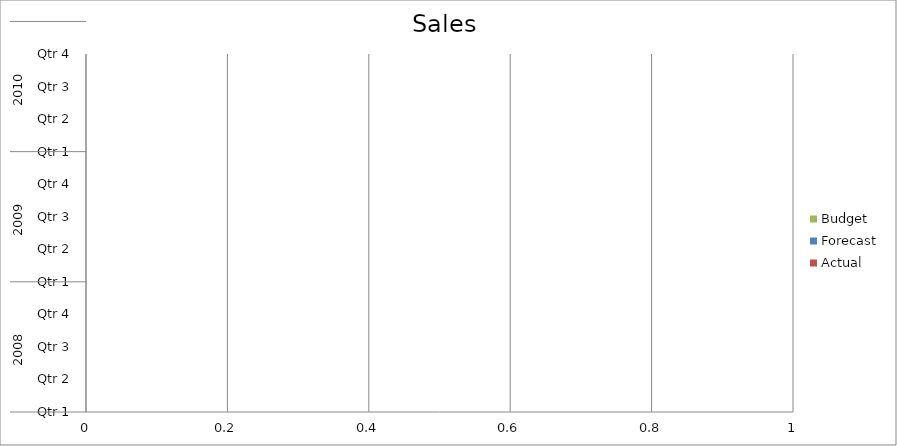
| Category | Budget | Forecast | Actual |
|---|---|---|---|
| 0 | 3420 | 3490 | 1020 |
| 1 | 1600 | 1290 | 3110 |
| 2 | 2160 | 2420 | 1310 |
| 3 | 1030 | 3050 | 2800 |
| 4 | 1270 | 3460 | 500 |
| 5 | 1450 | 2380 | 1500 |
| 6 | 2450 | 2210 | 2530 |
| 7 | 3030 | 840 | 1550 |
| 8 | 3450 | 2910 | 2670 |
| 9 | 1450 | 3240 | 2290 |
| 10 | 3480 | 2840 | 3450 |
| 11 | 1530 | 1150 | 1540 |